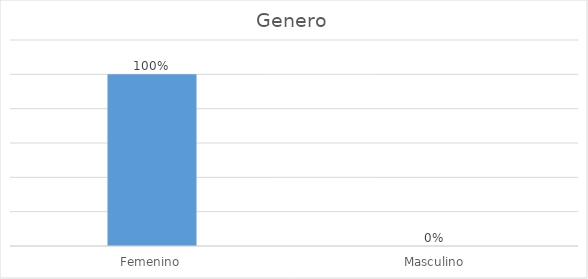
| Category | Series 0 |
|---|---|
| Femenino | 1 |
| Masculino | 0 |